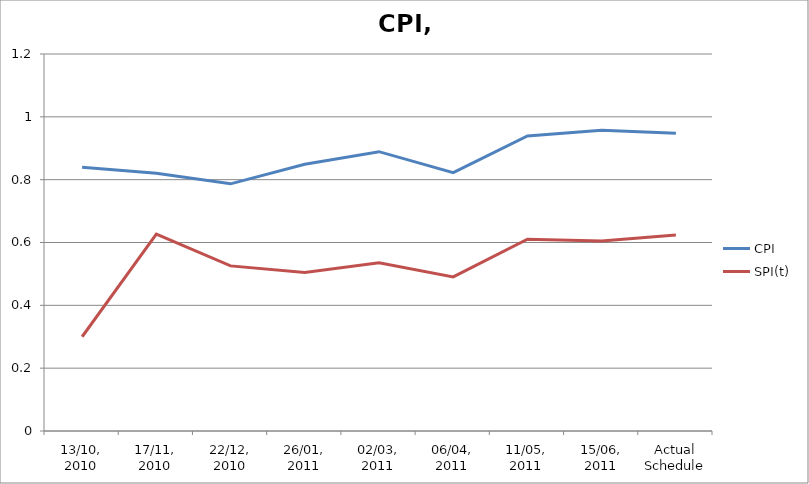
| Category | CPI | SPI(t) |
|---|---|---|
| 13/10, 2010 | 0.84 | 0.3 |
| 17/11, 2010 | 0.82 | 0.627 |
| 22/12, 2010 | 0.787 | 0.526 |
| 26/01, 2011 | 0.849 | 0.504 |
| 02/03, 2011 | 0.889 | 0.535 |
| 06/04, 2011 | 0.823 | 0.49 |
| 11/05, 2011 | 0.939 | 0.611 |
| 15/06, 2011 | 0.958 | 0.605 |
| Actual Schedule | 0.948 | 0.624 |